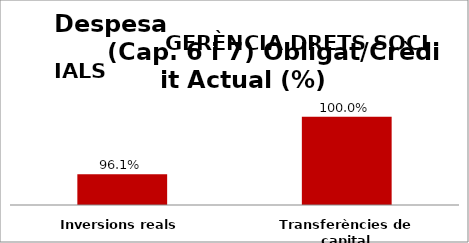
| Category | Series 0 |
|---|---|
| Inversions reals | 0.961 |
| Transferències de capital | 1 |